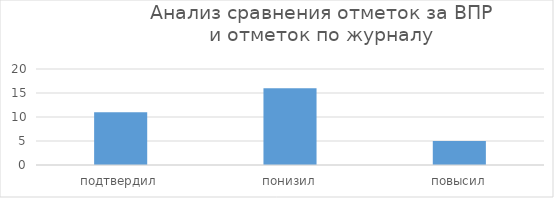
| Category | Series 0 |
|---|---|
| подтвердил | 11 |
| понизил | 16 |
| повысил | 5 |